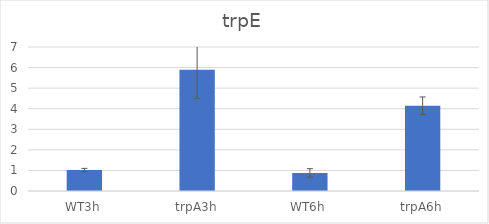
| Category | Series 0 |
|---|---|
| WT3h | 1.018 |
| trpA3h | 5.889 |
| WT6h | 0.88 |
| trpA6h | 4.146 |